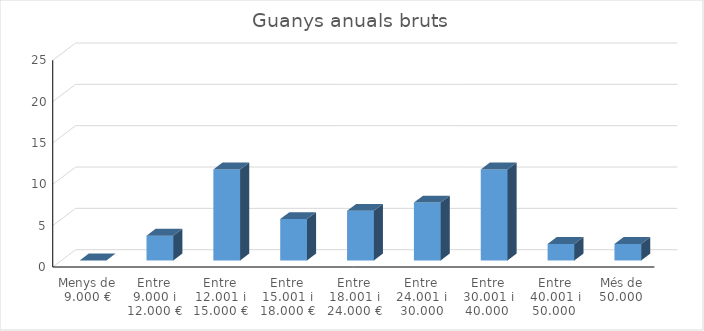
| Category | Series 0 |
|---|---|
| Menys de 9.000 € | 0 |
| Entre 9.000 i 12.000 € | 3 |
| Entre 12.001 i 15.000 € | 11 |
| Entre 15.001 i 18.000 € | 5 |
| Entre 18.001 i 24.000 € | 6 |
| Entre 24.001 i 30.000 | 7 |
| Entre 30.001 i 40.000  | 11 |
| Entre 40.001 i 50.000  | 2 |
| Més de 50.000  | 2 |